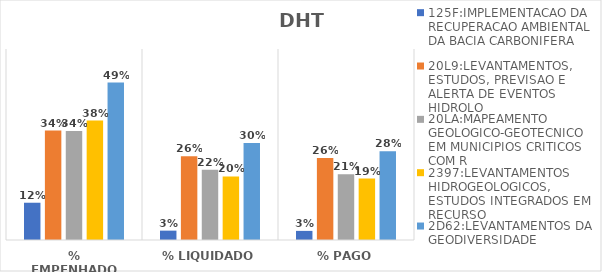
| Category | 125F:IMPLEMENTACAO DA RECUPERACAO AMBIENTAL DA BACIA CARBONIFERA | 20L9:LEVANTAMENTOS, ESTUDOS, PREVISAO E ALERTA DE EVENTOS HIDROLO | 20LA:MAPEAMENTO GEOLOGICO-GEOTECNICO EM MUNICIPIOS CRITICOS COM R | 2397:LEVANTAMENTOS HIDROGEOLOGICOS, ESTUDOS INTEGRADOS EM RECURSO | 2D62:LEVANTAMENTOS DA GEODIVERSIDADE |
|---|---|---|---|---|---|
| % EMPENHADO | 0.117 | 0.344 | 0.342 | 0.375 | 0.495 |
| % LIQUIDADO | 0.029 | 0.263 | 0.221 | 0.2 | 0.305 |
| % PAGO | 0.029 | 0.258 | 0.207 | 0.193 | 0.279 |